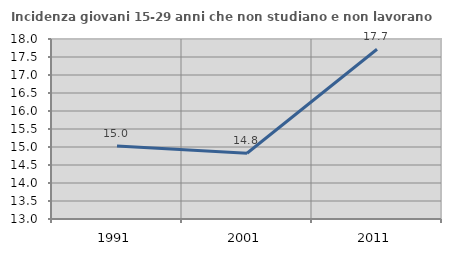
| Category | Incidenza giovani 15-29 anni che non studiano e non lavorano  |
|---|---|
| 1991.0 | 15.03 |
| 2001.0 | 14.826 |
| 2011.0 | 17.716 |